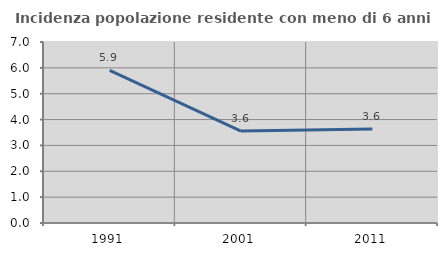
| Category | Incidenza popolazione residente con meno di 6 anni |
|---|---|
| 1991.0 | 5.9 |
| 2001.0 | 3.554 |
| 2011.0 | 3.64 |